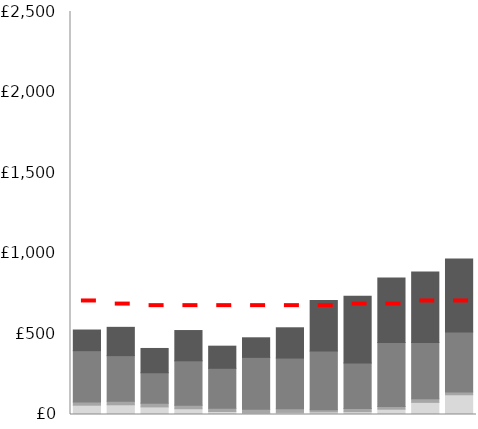
| Category | Donuts | Danish | Coffee | Tea |
|---|---|---|---|---|
| Jan | 57.693 | 20.16 | 318 | 128.25 |
| Feb | 60.21 | 21.504 | 283.5 | 175.5 |
| Mar | 47.045 | 22.848 | 189 | 150.75 |
| Apr | 35.816 | 22.176 | 275 | 187.875 |
| May | 18.779 | 19.354 | 248.5 | 137.25 |
| Jun | 9.68 | 22.176 | 322.5 | 121.5 |
| Jul | 12.971 | 23.117 | 314 | 187.875 |
| Aug | 16.262 | 12.634 | 365.5 | 312.75 |
| Sep | 17.811 | 19.354 | 283 | 412.875 |
| Oct | 32.912 | 16.531 | 396.5 | 400.5 |
| Nov | 75.31 | 21.907 | 349.5 | 437.625 |
| Dec | 122.355 | 17.203 | 372.5 | 452.25 |